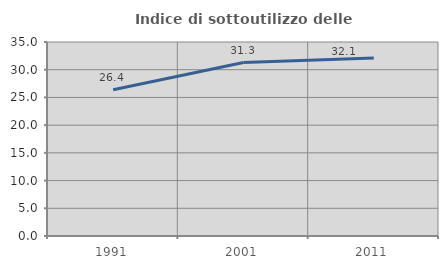
| Category | Indice di sottoutilizzo delle abitazioni  |
|---|---|
| 1991.0 | 26.369 |
| 2001.0 | 31.294 |
| 2011.0 | 32.1 |